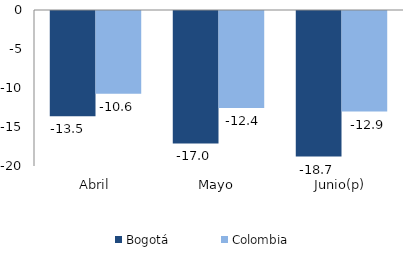
| Category | Bogotá | Colombia |
|---|---|---|
| Abril | -13.49 | -10.605 |
| Mayo | -16.976 | -12.449 |
| Junio(p) | -18.656 | -12.9 |